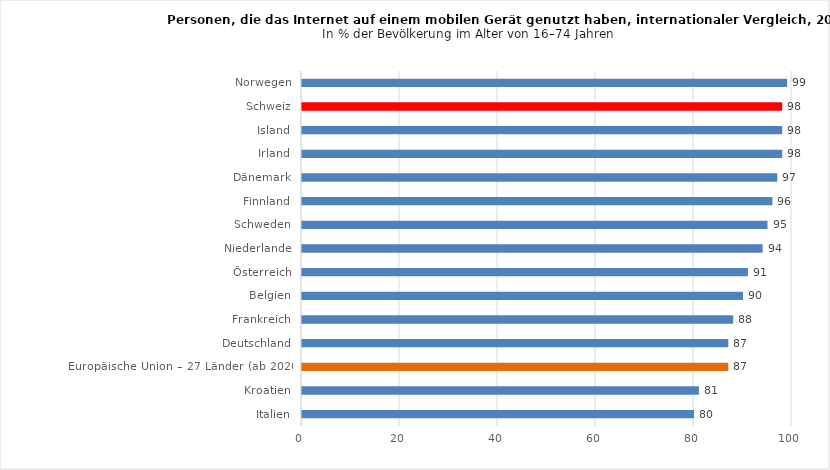
| Category | 2021 |
|---|---|
| Italien | 80 |
| Kroatien | 81 |
| Europäische Union – 27 Länder (ab 2020) | 87 |
| Deutschland | 87 |
| Frankreich | 88 |
| Belgien | 90 |
| Österreich | 91 |
| Niederlande | 94 |
| Schweden | 95 |
| Finnland | 96 |
| Dänemark | 97 |
| Irland | 98 |
| Island | 98 |
| Schweiz | 98 |
| Norwegen | 99 |